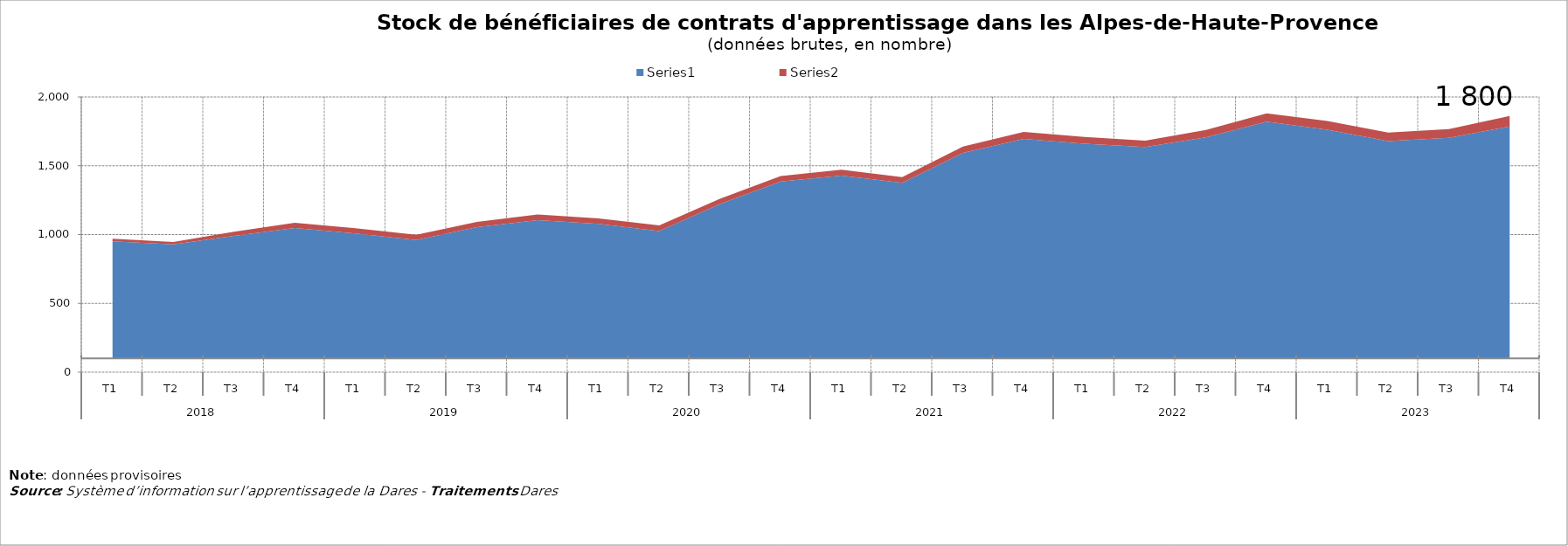
| Category | Series 0 | Series 1 |
|---|---|---|
| 0 | 951 | 19 |
| 1 | 928 | 18 |
| 2 | 991 | 29 |
| 3 | 1047 | 39 |
| 4 | 1008 | 38 |
| 5 | 960 | 38 |
| 6 | 1054 | 38 |
| 7 | 1105 | 41 |
| 8 | 1078 | 40 |
| 9 | 1026 | 40 |
| 10 | 1222 | 38 |
| 11 | 1385 | 41 |
| 12 | 1429 | 43 |
| 13 | 1376 | 41 |
| 14 | 1594 | 46 |
| 15 | 1695 | 51 |
| 16 | 1660 | 50 |
| 17 | 1637 | 45 |
| 18 | 1707 | 53 |
| 19 | 1821 | 60 |
| 20 | 1762 | 63 |
| 21 | 1680 | 62 |
| 22 | 1703 | 64 |
| 23 | 1786 | 76 |